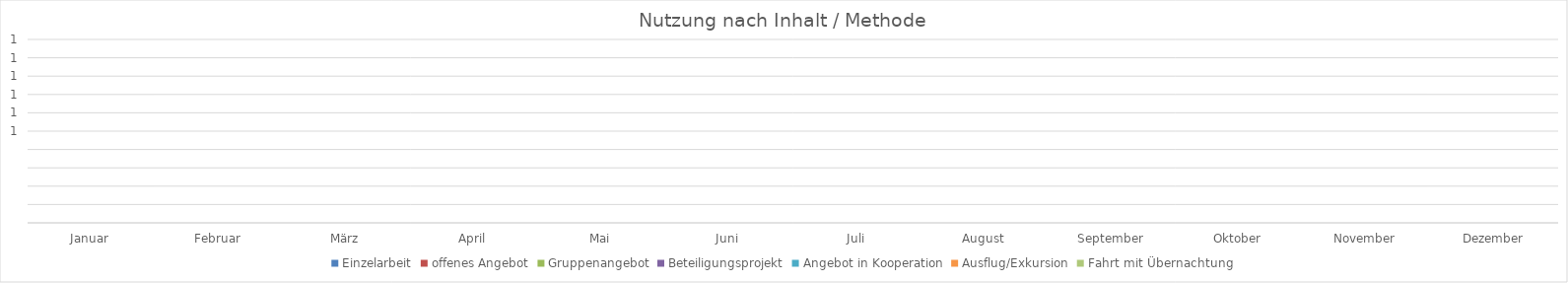
| Category | Einzelarbeit | offenes Angebot | Gruppenangebot | Beteiligungsprojekt | Angebot in Kooperation | Ausflug/Exkursion | Fahrt mit Übernachtung |
|---|---|---|---|---|---|---|---|
| Januar | 0 | 0 | 0 | 0 | 0 | 0 | 0 |
| Februar | 0 | 0 | 0 | 0 | 0 | 0 | 0 |
| März | 0 | 0 | 0 | 0 | 0 | 0 | 0 |
| April | 0 | 0 | 0 | 0 | 0 | 0 | 0 |
| Mai | 0 | 0 | 0 | 0 | 0 | 0 | 0 |
| Juni | 0 | 0 | 0 | 0 | 0 | 0 | 0 |
| Juli | 0 | 0 | 0 | 0 | 0 | 0 | 0 |
| August | 0 | 0 | 0 | 0 | 0 | 0 | 0 |
| September | 0 | 0 | 0 | 0 | 0 | 0 | 0 |
| Oktober | 0 | 0 | 0 | 0 | 0 | 0 | 0 |
| November | 0 | 0 | 0 | 0 | 0 | 0 | 0 |
| Dezember | 0 | 0 | 0 | 0 | 0 | 0 | 0 |